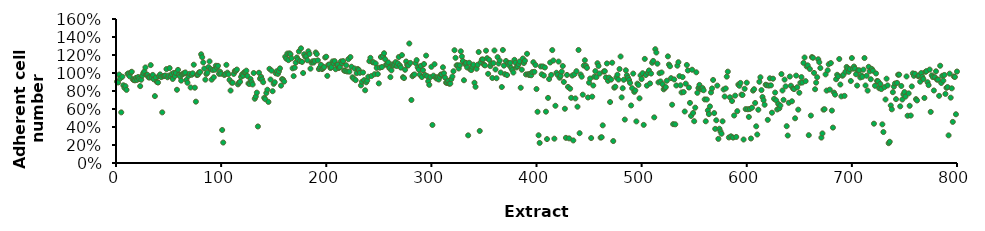
| Category | HepG2 |
|---|---|
| 1.0 | 0.904 |
| 2.0 | 0.895 |
| 3.0 | 0.982 |
| 4.0 | 0.94 |
| 5.0 | 0.563 |
| 6.0 | 0.958 |
| 7.0 | 0.863 |
| 8.0 | 0.835 |
| 9.0 | 0.854 |
| 10.0 | 0.812 |
| 11.0 | 0.991 |
| 12.0 | 0.996 |
| 13.0 | 0.963 |
| 14.0 | 1.005 |
| 15.0 | 1.014 |
| 16.0 | 0.93 |
| 17.0 | 0.921 |
| 18.0 | 0.918 |
| 19.0 | 0.946 |
| 20.0 | 0.923 |
| 21.0 | 0.955 |
| 22.0 | 0.935 |
| 23.0 | 0.854 |
| 24.0 | 0.925 |
| 25.0 | 0.971 |
| 26.0 | 1 |
| 27.0 | 1.018 |
| 28.0 | 1.062 |
| 29.0 | 0.979 |
| 30.0 | 0.98 |
| 31.0 | 0.952 |
| 32.0 | 0.949 |
| 33.0 | 1.088 |
| 34.0 | 0.953 |
| 35.0 | 0.979 |
| 36.0 | 0.93 |
| 37.0 | 0.743 |
| 38.0 | 0.949 |
| 39.0 | 0.9 |
| 40.0 | 0.894 |
| 41.0 | 0.966 |
| 42.0 | 0.984 |
| 43.0 | 0.954 |
| 44.0 | 0.563 |
| 45.0 | 0.964 |
| 46.0 | 0.968 |
| 47.0 | 0.972 |
| 48.0 | 1.044 |
| 49.0 | 0.953 |
| 50.0 | 0.971 |
| 51.0 | 1.055 |
| 52.0 | 0.965 |
| 53.0 | 0.988 |
| 54.0 | 0.934 |
| 55.0 | 1.001 |
| 56.0 | 0.966 |
| 57.0 | 1.001 |
| 58.0 | 0.814 |
| 59.0 | 1.035 |
| 60.0 | 0.981 |
| 61.0 | 0.961 |
| 62.0 | 0.915 |
| 63.0 | 0.983 |
| 64.0 | 0.994 |
| 65.0 | 0.997 |
| 66.0 | 1.006 |
| 67.0 | 0.923 |
| 68.0 | 0.892 |
| 69.0 | 0.967 |
| 70.0 | 0.991 |
| 71.0 | 0.839 |
| 72.0 | 0.98 |
| 73.0 | 0.996 |
| 74.0 | 1.092 |
| 75.0 | 0.837 |
| 76.0 | 0.682 |
| 77.0 | 0.977 |
| 78.0 | 0.981 |
| 79.0 | 1.006 |
| 80.0 | 1.01 |
| 81.0 | 1.208 |
| 82.0 | 1.176 |
| 83.0 | 1.117 |
| 84.0 | 1.049 |
| 85.0 | 0.926 |
| 86.0 | 0.99 |
| 87.0 | 1.003 |
| 88.0 | 1.066 |
| 89.0 | 1.129 |
| 90.0 | 1.044 |
| 91.0 | 0.926 |
| 92.0 | 1.033 |
| 93.0 | 0.952 |
| 94.0 | 1.036 |
| 95.0 | 1.081 |
| 96.0 | 1.06 |
| 97.0 | 1.08 |
| 98.0 | 0.991 |
| 99.0 | 1.014 |
| 100.0 | 0.992 |
| 101.0 | 0.367 |
| 102.0 | 0.227 |
| 103.0 | 0.978 |
| 104.0 | 0.988 |
| 105.0 | 1.091 |
| 106.0 | 1.004 |
| 107.0 | 0.986 |
| 108.0 | 0.923 |
| 109.0 | 0.805 |
| 110.0 | 0.894 |
| 111.0 | 0.892 |
| 112.0 | 0.99 |
| 113.0 | 1.022 |
| 114.0 | 1.023 |
| 115.0 | 1.038 |
| 116.0 | 0.874 |
| 117.0 | 0.893 |
| 118.0 | 0.902 |
| 119.0 | 0.956 |
| 120.0 | 0.986 |
| 121.0 | 0.971 |
| 122.0 | 1.008 |
| 123.0 | 1.01 |
| 124.0 | 1.026 |
| 125.0 | 0.967 |
| 126.0 | 0.884 |
| 127.0 | 0.878 |
| 128.0 | 0.933 |
| 129.0 | 0.899 |
| 130.0 | 0.873 |
| 131.0 | 1 |
| 132.0 | 0.714 |
| 133.0 | 0.739 |
| 134.0 | 0.782 |
| 135.0 | 0.406 |
| 136.0 | 1.003 |
| 137.0 | 0.937 |
| 138.0 | 0.957 |
| 139.0 | 0.929 |
| 140.0 | 0.898 |
| 141.0 | 0.724 |
| 142.0 | 0.709 |
| 143.0 | 0.778 |
| 144.0 | 0.814 |
| 145.0 | 0.679 |
| 146.0 | 1.046 |
| 147.0 | 0.927 |
| 148.0 | 1.026 |
| 149.0 | 0.798 |
| 150.0 | 0.88 |
| 151.0 | 0.897 |
| 152.0 | 0.997 |
| 153.0 | 1.02 |
| 154.0 | 0.99 |
| 155.0 | 1.018 |
| 156.0 | 1.051 |
| 157.0 | 0.859 |
| 158.0 | 0.932 |
| 159.0 | 0.925 |
| 160.0 | 0.905 |
| 161.0 | 1.181 |
| 162.0 | 1.159 |
| 163.0 | 1.216 |
| 164.0 | 1.143 |
| 165.0 | 1.219 |
| 166.0 | 1.208 |
| 167.0 | 1.163 |
| 168.0 | 1.052 |
| 169.0 | 0.965 |
| 170.0 | 1.059 |
| 171.0 | 1.114 |
| 172.0 | 1.172 |
| 173.0 | 1.151 |
| 174.0 | 1.24 |
| 175.0 | 1.132 |
| 176.0 | 1.274 |
| 177.0 | 1.123 |
| 178.0 | 1 |
| 179.0 | 1.208 |
| 180.0 | 1.182 |
| 181.0 | 1.185 |
| 182.0 | 1.142 |
| 183.0 | 1.241 |
| 184.0 | 1.211 |
| 185.0 | 1.048 |
| 186.0 | 1.114 |
| 187.0 | 1.13 |
| 188.0 | 1.116 |
| 189.0 | 1.133 |
| 190.0 | 1.228 |
| 191.0 | 1.21 |
| 192.0 | 1.14 |
| 193.0 | 1.043 |
| 194.0 | 1.062 |
| 195.0 | 1.091 |
| 196.0 | 1.043 |
| 197.0 | 1.054 |
| 198.0 | 1.066 |
| 199.0 | 1.172 |
| 200.0 | 1.181 |
| 201.0 | 0.968 |
| 202.0 | 1.092 |
| 203.0 | 1.093 |
| 204.0 | 1.055 |
| 205.0 | 1.065 |
| 206.0 | 1.129 |
| 207.0 | 1.109 |
| 208.0 | 1.132 |
| 209.0 | 1.042 |
| 210.0 | 1.092 |
| 211.0 | 1.093 |
| 212.0 | 1.055 |
| 213.0 | 1.065 |
| 214.0 | 1.129 |
| 215.0 | 1.109 |
| 216.0 | 1.132 |
| 217.0 | 1.028 |
| 218.0 | 1.022 |
| 219.0 | 1.086 |
| 220.0 | 1.016 |
| 221.0 | 1.154 |
| 222.0 | 1.015 |
| 223.0 | 1.177 |
| 224.0 | 1.07 |
| 225.0 | 0.952 |
| 226.0 | 0.938 |
| 227.0 | 1.049 |
| 228.0 | 0.92 |
| 229.0 | 0.999 |
| 230.0 | 1.045 |
| 231.0 | 1.033 |
| 232.0 | 1.002 |
| 233.0 | 0.862 |
| 234.0 | 0.903 |
| 235.0 | 1.006 |
| 236.0 | 0.92 |
| 237.0 | 0.808 |
| 238.0 | 0.897 |
| 239.0 | 0.917 |
| 240.0 | 0.958 |
| 241.0 | 1.132 |
| 242.0 | 1.168 |
| 243.0 | 0.966 |
| 244.0 | 1.12 |
| 245.0 | 1.119 |
| 246.0 | 0.987 |
| 247.0 | 1.106 |
| 248.0 | 1.056 |
| 249.0 | 0.988 |
| 250.0 | 0.885 |
| 251.0 | 1.059 |
| 252.0 | 1.177 |
| 253.0 | 1.066 |
| 254.0 | 1.189 |
| 255.0 | 1.219 |
| 256.0 | 1.153 |
| 257.0 | 1.091 |
| 258.0 | 1.098 |
| 259.0 | 1.118 |
| 260.0 | 1.055 |
| 261.0 | 0.954 |
| 262.0 | 1.03 |
| 263.0 | 1.096 |
| 264.0 | 1.082 |
| 265.0 | 1.095 |
| 266.0 | 1.121 |
| 267.0 | 1.077 |
| 268.0 | 1.107 |
| 269.0 | 1.177 |
| 270.0 | 1.084 |
| 271.0 | 1.06 |
| 272.0 | 1.199 |
| 273.0 | 0.953 |
| 274.0 | 0.944 |
| 275.0 | 1.036 |
| 276.0 | 1.128 |
| 277.0 | 1.09 |
| 278.0 | 1.083 |
| 279.0 | 1.328 |
| 280.0 | 1.112 |
| 281.0 | 0.7 |
| 282.0 | 0.964 |
| 283.0 | 0.979 |
| 284.0 | 0.984 |
| 285.0 | 1.11 |
| 286.0 | 1.143 |
| 287.0 | 1.064 |
| 288.0 | 1.038 |
| 289.0 | 0.981 |
| 290.0 | 1.079 |
| 291.0 | 0.955 |
| 292.0 | 1.031 |
| 293.0 | 1.099 |
| 294.0 | 0.978 |
| 295.0 | 1.193 |
| 296.0 | 0.965 |
| 297.0 | 0.908 |
| 298.0 | 0.868 |
| 299.0 | 0.953 |
| 300.0 | 1.069 |
| 301.0 | 0.423 |
| 302.0 | 0.97 |
| 303.0 | 1.098 |
| 304.0 | 0.951 |
| 305.0 | 0.938 |
| 306.0 | 0.953 |
| 307.0 | 0.927 |
| 308.0 | 0.957 |
| 309.0 | 0.983 |
| 310.0 | 0.982 |
| 311.0 | 1.064 |
| 312.0 | 0.997 |
| 313.0 | 0.949 |
| 314.0 | 0.893 |
| 315.0 | 0.889 |
| 316.0 | 0.914 |
| 317.0 | 0.881 |
| 318.0 | 0.883 |
| 319.0 | 0.932 |
| 320.0 | 0.961 |
| 321.0 | 1.02 |
| 322.0 | 1.253 |
| 323.0 | 1.169 |
| 324.0 | 1.084 |
| 325.0 | 1.086 |
| 326.0 | 1.05 |
| 327.0 | 1.086 |
| 328.0 | 1.241 |
| 329.0 | 1.185 |
| 330.0 | 1.133 |
| 331.0 | 0.919 |
| 332.0 | 1.1 |
| 333.0 | 1.112 |
| 334.0 | 1.062 |
| 335.0 | 0.307 |
| 336.0 | 1.113 |
| 337.0 | 1.039 |
| 338.0 | 1.033 |
| 339.0 | 1.07 |
| 340.0 | 1.092 |
| 341.0 | 0.892 |
| 342.0 | 0.847 |
| 343.0 | 1.047 |
| 344.0 | 1.091 |
| 345.0 | 1.233 |
| 346.0 | 0.356 |
| 347.0 | 1.12 |
| 348.0 | 1.15 |
| 349.0 | 1.15 |
| 350.0 | 1.092 |
| 351.0 | 1.084 |
| 352.0 | 1.248 |
| 353.0 | 1.165 |
| 354.0 | 0.991 |
| 355.0 | 1.146 |
| 356.0 | 1.076 |
| 357.0 | 1.104 |
| 358.0 | 0.944 |
| 359.0 | 1.109 |
| 360.0 | 1.25 |
| 361.0 | 1.039 |
| 362.0 | 0.942 |
| 363.0 | 1.177 |
| 364.0 | 1.105 |
| 365.0 | 1.138 |
| 366.0 | 1.005 |
| 367.0 | 0.844 |
| 368.0 | 1.256 |
| 369.0 | 1.082 |
| 370.0 | 0.987 |
| 371.0 | 1.133 |
| 372.0 | 0.977 |
| 373.0 | 1.108 |
| 374.0 | 1.086 |
| 375.0 | 1.112 |
| 376.0 | 1.055 |
| 377.0 | 1.033 |
| 378.0 | 1.005 |
| 379.0 | 1.146 |
| 380.0 | 1.115 |
| 381.0 | 1.062 |
| 382.0 | 1.075 |
| 383.0 | 1.099 |
| 384.0 | 1.128 |
| 385.0 | 0.836 |
| 386.0 | 1.037 |
| 387.0 | 1.161 |
| 388.0 | 1.111 |
| 389.0 | 1.136 |
| 390.0 | 0.984 |
| 391.0 | 1.214 |
| 392.0 | 0.987 |
| 393.0 | 0.977 |
| 394.0 | 0.991 |
| 395.0 | 0.975 |
| 396.0 | 1.01 |
| 397.0 | 1.12 |
| 398.0 | 1.013 |
| 399.0 | 1.09 |
| 400.0 | 0.822 |
| 401.0 | 0.569 |
| 402.0 | 0.308 |
| 403.0 | 0.223 |
| 404.0 | 1.073 |
| 405.0 | 0.985 |
| 406.0 | 1.073 |
| 407.0 | 0.972 |
| 408.0 | 1.061 |
| 409.0 | 0.57 |
| 410.0 | 0.266 |
| 411.0 | 0.723 |
| 412.0 | 0.933 |
| 413.0 | 1.117 |
| 414.0 | 0.979 |
| 415.0 | 1.255 |
| 416.0 | 1.138 |
| 417.0 | 0.27 |
| 418.0 | 0.636 |
| 419.0 | 1.003 |
| 420.0 | 0.98 |
| 421.0 | 1.127 |
| 422.0 | 0.948 |
| 423.0 | 0.969 |
| 424.0 | 1.015 |
| 425.0 | 1.077 |
| 426.0 | 0.9 |
| 427.0 | 0.603 |
| 428.0 | 0.279 |
| 429.0 | 0.979 |
| 430.0 | 0.845 |
| 431.0 | 0.274 |
| 432.0 | 0.826 |
| 433.0 | 0.724 |
| 434.0 | 0.972 |
| 435.0 | 0.251 |
| 436.0 | 0.985 |
| 437.0 | 0.718 |
| 438.0 | 1.02 |
| 439.0 | 0.626 |
| 440.0 | 1.256 |
| 441.0 | 0.331 |
| 442.0 | 0.983 |
| 443.0 | 0.959 |
| 444.0 | 0.759 |
| 445.0 | 1.082 |
| 446.0 | 1.142 |
| 447.0 | 1.081 |
| 448.0 | 1.057 |
| 449.0 | 0.728 |
| 450.0 | 0.892 |
| 451.0 | 0.938 |
| 452.0 | 0.277 |
| 453.0 | 0.737 |
| 454.0 | 0.861 |
| 455.0 | 0.959 |
| 456.0 | 1.021 |
| 457.0 | 0.954 |
| 458.0 | 1.109 |
| 459.0 | 1.079 |
| 460.0 | 0.994 |
| 461.0 | 0.282 |
| 462.0 | 0.286 |
| 463.0 | 0.419 |
| 464.0 | 1.017 |
| 465.0 | 1.02 |
| 466.0 | 0.951 |
| 467.0 | 1.106 |
| 468.0 | 0.913 |
| 469.0 | 0.949 |
| 470.0 | 0.677 |
| 471.0 | 0.927 |
| 472.0 | 1.114 |
| 473.0 | 0.244 |
| 474.0 | 0.837 |
| 475.0 | 0.847 |
| 476.0 | 0.951 |
| 477.0 | 0.981 |
| 478.0 | 0.927 |
| 479.0 | 1.044 |
| 480.0 | 1.183 |
| 481.0 | 0.729 |
| 482.0 | 0.831 |
| 483.0 | 0.924 |
| 484.0 | 0.483 |
| 485.0 | 1.03 |
| 486.0 | 0.975 |
| 487.0 | 0.949 |
| 488.0 | 0.922 |
| 489.0 | 0.89 |
| 490.0 | 0.639 |
| 491.0 | 0.831 |
| 492.0 | 0.994 |
| 493.0 | 0.79 |
| 494.0 | 0.806 |
| 495.0 | 0.462 |
| 496.0 | 0.882 |
| 497.0 | 0.867 |
| 498.0 | 0.719 |
| 499.0 | 0.973 |
| 500.0 | 0.933 |
| 501.0 | 0.998 |
| 502.0 | 0.424 |
| 503.0 | 1.157 |
| 504.0 | 0.977 |
| 505.0 | 0.859 |
| 506.0 | 1.004 |
| 507.0 | 1.028 |
| 508.0 | 0.884 |
| 509.0 | 0.994 |
| 510.0 | 1.114 |
| 511.0 | 1.134 |
| 512.0 | 0.507 |
| 513.0 | 1.264 |
| 514.0 | 1.228 |
| 515.0 | 1.104 |
| 516.0 | 0.896 |
| 517.0 | 0.998 |
| 518.0 | 0.906 |
| 519.0 | 1.006 |
| 520.0 | 0.876 |
| 521.0 | 0.819 |
| 522.0 | 0.833 |
| 523.0 | 0.843 |
| 524.0 | 0.914 |
| 525.0 | 1.185 |
| 526.0 | 1.093 |
| 527.0 | 1.075 |
| 528.0 | 0.943 |
| 529.0 | 0.647 |
| 530.0 | 0.432 |
| 531.0 | 0.928 |
| 532.0 | 0.43 |
| 533.0 | 0.861 |
| 534.0 | 1.081 |
| 535.0 | 1.12 |
| 536.0 | 0.965 |
| 537.0 | 0.863 |
| 538.0 | 0.784 |
| 539.0 | 0.955 |
| 540.0 | 0.788 |
| 541.0 | 0.572 |
| 542.0 | 0.882 |
| 543.0 | 1.089 |
| 544.0 | 1.028 |
| 545.0 | 0.839 |
| 546.0 | 0.668 |
| 547.0 | 0.523 |
| 548.0 | 1.036 |
| 549.0 | 0.556 |
| 550.0 | 0.464 |
| 551.0 | 0.615 |
| 552.0 | 1.008 |
| 553.0 | 0.78 |
| 554.0 | 0.833 |
| 555.0 | 0.867 |
| 556.0 | 0.827 |
| 557.0 | 0.819 |
| 558.0 | 0.833 |
| 559.0 | 0.808 |
| 560.0 | 0.707 |
| 561.0 | 0.463 |
| 562.0 | 0.706 |
| 563.0 | 0.585 |
| 564.0 | 0.543 |
| 565.0 | 0.629 |
| 566.0 | 0.784 |
| 567.0 | 0.828 |
| 568.0 | 0.922 |
| 569.0 | 0.555 |
| 570.0 | 0.379 |
| 571.0 | 0.475 |
| 572.0 | 0.86 |
| 573.0 | 0.268 |
| 574.0 | 0.381 |
| 575.0 | 0.351 |
| 576.0 | 0.325 |
| 577.0 | 0.463 |
| 578.0 | 0.817 |
| 579.0 | 0.739 |
| 580.0 | 0.828 |
| 581.0 | 0.96 |
| 582.0 | 1.015 |
| 583.0 | 0.284 |
| 584.0 | 0.73 |
| 585.0 | 0.297 |
| 586.0 | 0.689 |
| 587.0 | 0.282 |
| 588.0 | 0.528 |
| 589.0 | 0.749 |
| 590.0 | 0.289 |
| 591.0 | 0.576 |
| 592.0 | 0.871 |
| 593.0 | 0.858 |
| 594.0 | 0.89 |
| 595.0 | 0.76 |
| 596.0 | 0.756 |
| 597.0 | 0.261 |
| 598.0 | 0.824 |
| 599.0 | 0.599 |
| 600.0 | 0.893 |
| 601.0 | 0.597 |
| 602.0 | 0.512 |
| 603.0 | 0.6 |
| 604.0 | 0.272 |
| 605.0 | 0.615 |
| 606.0 | 0.804 |
| 607.0 | 0.82 |
| 608.0 | 0.667 |
| 609.0 | 0.408 |
| 610.0 | 0.317 |
| 611.0 | 0.592 |
| 612.0 | 0.903 |
| 613.0 | 0.952 |
| 614.0 | 0.81 |
| 615.0 | 0.733 |
| 616.0 | 0.697 |
| 617.0 | 0.647 |
| 618.0 | 0.87 |
| 619.0 | 0.864 |
| 620.0 | 0.479 |
| 621.0 | 0.86 |
| 622.0 | 0.941 |
| 623.0 | 0.863 |
| 624.0 | 0.559 |
| 625.0 | 0.937 |
| 626.0 | 0.713 |
| 627.0 | 0.783 |
| 628.0 | 0.696 |
| 629.0 | 0.595 |
| 630.0 | 0.656 |
| 631.0 | 0.607 |
| 632.0 | 0.639 |
| 633.0 | 0.988 |
| 634.0 | 0.806 |
| 635.0 | 0.701 |
| 636.0 | 0.927 |
| 637.0 | 0.851 |
| 638.0 | 0.409 |
| 639.0 | 0.305 |
| 640.0 | 0.669 |
| 641.0 | 0.961 |
| 642.0 | 0.859 |
| 643.0 | 0.686 |
| 644.0 | 0.829 |
| 645.0 | 0.821 |
| 646.0 | 0.497 |
| 647.0 | 0.971 |
| 648.0 | 0.842 |
| 649.0 | 0.593 |
| 650.0 | 0.78 |
| 651.0 | 0.892 |
| 652.0 | 0.955 |
| 653.0 | 0.895 |
| 654.0 | 1.112 |
| 655.0 | 1.172 |
| 656.0 | 0.91 |
| 657.0 | 1.073 |
| 658.0 | 1.085 |
| 659.0 | 0.309 |
| 660.0 | 1.045 |
| 661.0 | 0.527 |
| 662.0 | 1.177 |
| 663.0 | 1.169 |
| 664.0 | 1.001 |
| 665.0 | 0.82 |
| 666.0 | 0.893 |
| 667.0 | 0.953 |
| 668.0 | 1.153 |
| 669.0 | 1.12 |
| 670.0 | 1.055 |
| 671.0 | 0.282 |
| 672.0 | 0.329 |
| 673.0 | 0.593 |
| 674.0 | 0.597 |
| 675.0 | 0.985 |
| 676.0 | 0.805 |
| 677.0 | 1.03 |
| 678.0 | 1.097 |
| 679.0 | 0.815 |
| 680.0 | 1.111 |
| 681.0 | 0.582 |
| 682.0 | 0.393 |
| 683.0 | 0.782 |
| 684.0 | 0.759 |
| 685.0 | 0.931 |
| 686.0 | 0.98 |
| 687.0 | 0.962 |
| 688.0 | 1.156 |
| 689.0 | 0.872 |
| 690.0 | 0.74 |
| 691.0 | 0.97 |
| 692.0 | 0.982 |
| 693.0 | 0.746 |
| 694.0 | 1.015 |
| 695.0 | 1.067 |
| 696.0 | 1.051 |
| 697.0 | 1.013 |
| 698.0 | 1.043 |
| 699.0 | 0.911 |
| 700.0 | 1.166 |
| 701.0 | 1.048 |
| 702.0 | 1.072 |
| 703.0 | 1.049 |
| 704.0 | 0.986 |
| 705.0 | 0.86 |
| 706.0 | 1.028 |
| 707.0 | 1.03 |
| 708.0 | 0.95 |
| 709.0 | 0.974 |
| 710.0 | 0.958 |
| 711.0 | 1.037 |
| 712.0 | 1.166 |
| 713.0 | 0.862 |
| 714.0 | 0.97 |
| 715.0 | 0.805 |
| 716.0 | 1.069 |
| 717.0 | 1.019 |
| 718.0 | 0.931 |
| 719.0 | 1.045 |
| 720.0 | 1.025 |
| 721.0 | 0.437 |
| 722.0 | 0.858 |
| 723.0 | 0.995 |
| 724.0 | 0.912 |
| 725.0 | 0.907 |
| 726.0 | 0.831 |
| 727.0 | 0.878 |
| 728.0 | 0.821 |
| 729.0 | 0.43 |
| 730.0 | 0.344 |
| 731.0 | 0.843 |
| 732.0 | 0.706 |
| 733.0 | 0.937 |
| 734.0 | 0.862 |
| 735.0 | 0.22 |
| 736.0 | 0.236 |
| 737.0 | 0.639 |
| 738.0 | 0.596 |
| 739.0 | 0.787 |
| 740.0 | 0.849 |
| 741.0 | 0.883 |
| 742.0 | 0.709 |
| 743.0 | 0.89 |
| 744.0 | 0.981 |
| 745.0 | 0.982 |
| 746.0 | 0.63 |
| 747.0 | 0.856 |
| 748.0 | 0.706 |
| 749.0 | 0.763 |
| 750.0 | 0.788 |
| 751.0 | 0.738 |
| 752.0 | 0.962 |
| 753.0 | 0.525 |
| 754.0 | 0.774 |
| 755.0 | 0.636 |
| 756.0 | 0.527 |
| 757.0 | 0.851 |
| 758.0 | 0.996 |
| 759.0 | 0.969 |
| 760.0 | 0.991 |
| 761.0 | 0.709 |
| 762.0 | 0.695 |
| 763.0 | 0.965 |
| 764.0 | 0.972 |
| 765.0 | 0.903 |
| 766.0 | 1 |
| 767.0 | 0.957 |
| 768.0 | 0.933 |
| 769.0 | 0.722 |
| 770.0 | 1.013 |
| 771.0 | 1.021 |
| 772.0 | 0.897 |
| 773.0 | 0.865 |
| 774.0 | 1.038 |
| 775.0 | 0.568 |
| 776.0 | 0.974 |
| 777.0 | 0.954 |
| 778.0 | 0.806 |
| 779.0 | 0.953 |
| 780.0 | 1.019 |
| 781.0 | 0.926 |
| 782.0 | 0.927 |
| 783.0 | 0.746 |
| 784.0 | 1.081 |
| 785.0 | 0.889 |
| 786.0 | 0.969 |
| 787.0 | 0.915 |
| 788.0 | 0.978 |
| 789.0 | 0.768 |
| 790.0 | 0.835 |
| 791.0 | 0.844 |
| 792.0 | 0.307 |
| 793.0 | 0.993 |
| 794.0 | 0.726 |
| 795.0 | 0.83 |
| 796.0 | 0.457 |
| 797.0 | 0.962 |
| 798.0 | 0.956 |
| 799.0 | 0.542 |
| 800.0 | 1.016 |